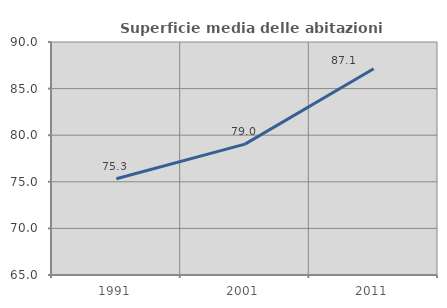
| Category | Superficie media delle abitazioni occupate |
|---|---|
| 1991.0 | 75.335 |
| 2001.0 | 79.039 |
| 2011.0 | 87.132 |